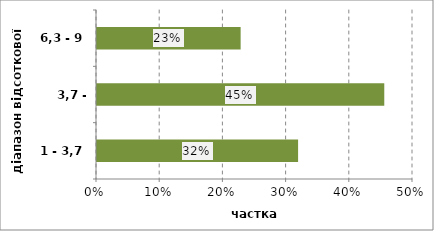
| Category | Series 0 |
|---|---|
| 1 - 3,7 | 0.318 |
| 3,7 - 6,3 | 0.455 |
| 6,3 - 9 | 0.227 |